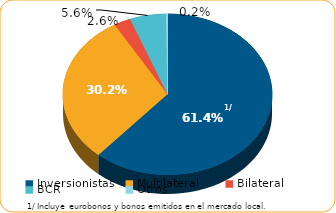
| Category | Series 0 |
|---|---|
| Inversionistas | 7757.3 |
| Multilateral | 3808.3 |
| Bilateral | 326 |
| BCR | 704.3 |
| Otros | 31.5 |